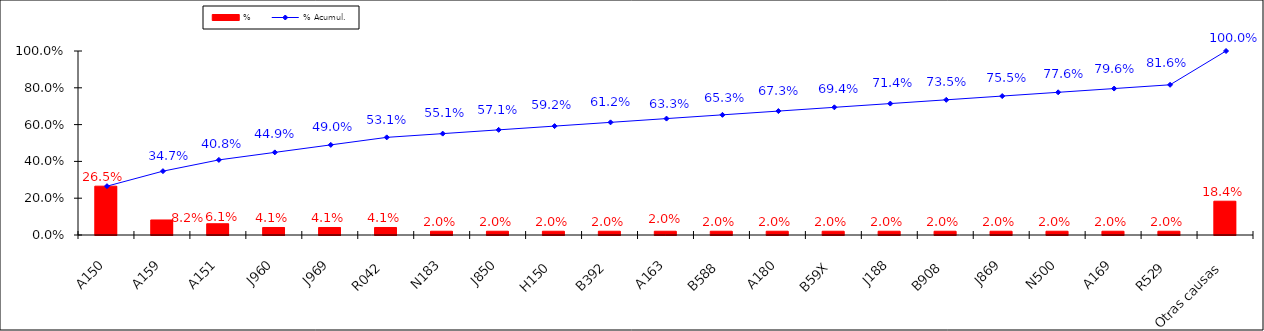
| Category | % |
|---|---|
| A150 | 0.265 |
| A159 | 0.082 |
| A151 | 0.061 |
| J960 | 0.041 |
| J969 | 0.041 |
| R042 | 0.041 |
| N183 | 0.02 |
| J850 | 0.02 |
| H150 | 0.02 |
| B392 | 0.02 |
| A163 | 0.02 |
| B588 | 0.02 |
| A180 | 0.02 |
| B59X | 0.02 |
| J188 | 0.02 |
| B908 | 0.02 |
| J869 | 0.02 |
| N500 | 0.02 |
| A169 | 0.02 |
| R529 | 0.02 |
| Otras causas | 0.184 |